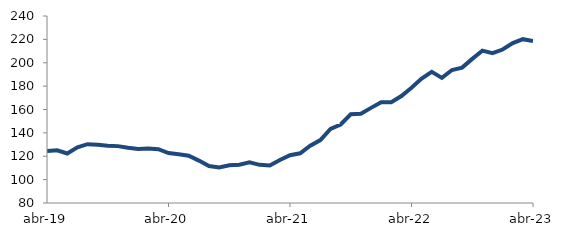
| Category | Series 0 |
|---|---|
| 2019-04-01 | 124.541 |
| 2019-05-01 | 125.115 |
| 2019-06-01 | 122.365 |
| 2019-07-01 | 127.653 |
| 2019-08-01 | 130.323 |
| 2019-09-01 | 129.814 |
| 2019-10-01 | 129.013 |
| 2019-11-01 | 128.663 |
| 2019-12-01 | 127.192 |
| 2020-01-01 | 126.144 |
| 2020-02-01 | 126.638 |
| 2020-03-01 | 125.992 |
| 2020-04-01 | 122.726 |
| 2020-05-01 | 121.669 |
| 2020-06-01 | 120.485 |
| 2020-07-01 | 116.268 |
| 2020-08-01 | 111.597 |
| 2020-09-01 | 110.39 |
| 2020-10-01 | 112.229 |
| 2020-11-01 | 112.769 |
| 2020-12-01 | 114.741 |
| 2021-01-01 | 112.625 |
| 2021-02-01 | 112.14 |
| 2021-03-01 | 116.74 |
| 2021-04-01 | 120.911 |
| 2021-05-01 | 122.536 |
| 2021-06-01 | 128.968 |
| 2021-07-01 | 133.864 |
| 2021-08-01 | 143.384 |
| 2021-09-01 | 147.196 |
| 2021-10-01 | 155.883 |
| 2021-11-01 | 156.426 |
| 2021-12-01 | 161.4 |
| 2022-01-01 | 166.276 |
| 2022-02-01 | 166.219 |
| 2022-03-01 | 171.531 |
| 2022-04-01 | 178.644 |
| 2022-05-01 | 186.465 |
| 2022-06-01 | 192.187 |
| 2022-07-01 | 187.044 |
| 2022-08-01 | 193.806 |
| 2022-09-01 | 195.846 |
| 2022-10-01 | 203.287 |
| 2022-11-01 | 210.344 |
| 2022-12-01 | 208.16 |
| 2023-01-01 | 211.29 |
| 2023-02-01 | 216.772 |
| 2023-03-01 | 220.156 |
| 2023-04-01 | 218.537 |